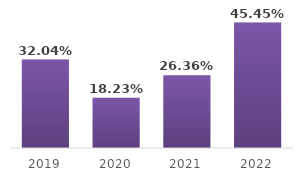
| Category | Series 0 |
|---|---|
| 2019.0 | 0.32 |
| 2020.0 | 0.182 |
| 2021.0 | 0.264 |
| 2022.0 | 0.455 |